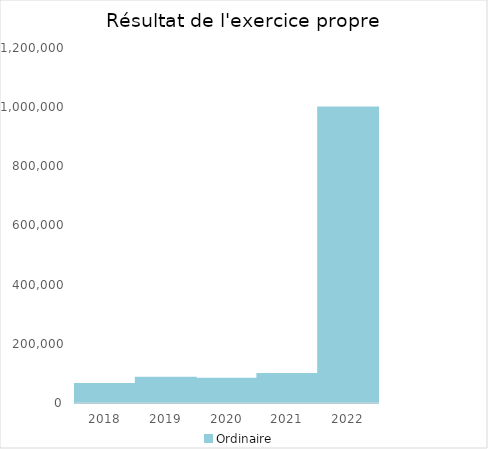
| Category |   | Ordinaire |    |
|---|---|---|---|
| 2018.0 |  | 64429.37 |  |
| 2019.0 |  | 85035.98 |  |
| 2020.0 |  | 81598.29 |  |
| 2021.0 |  | 98412.75 |  |
| 2022.0 |  | 998691.5 |  |